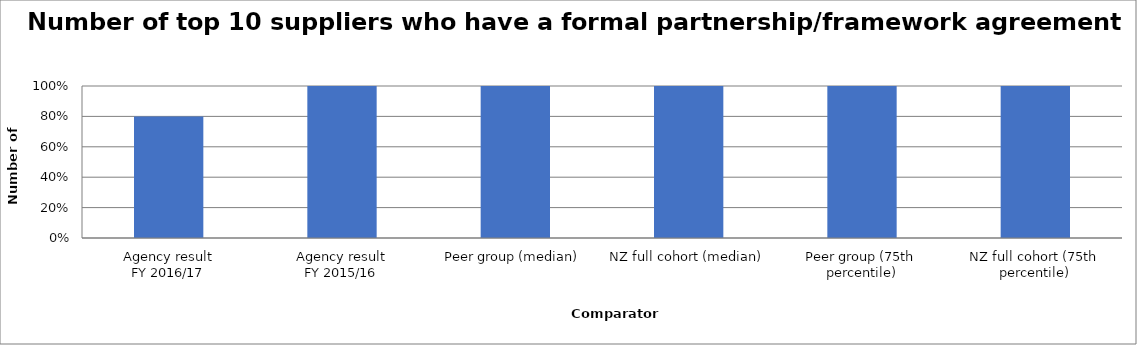
| Category | Series 0 |
|---|---|
| Agency result
FY 2016/17 | 0.8 |
| Agency result
FY 2015/16 | 1 |
| Peer group (median) | 1 |
| NZ full cohort (median) | 1 |
| Peer group (75th percentile) | 1 |
| NZ full cohort (75th percentile) | 1 |